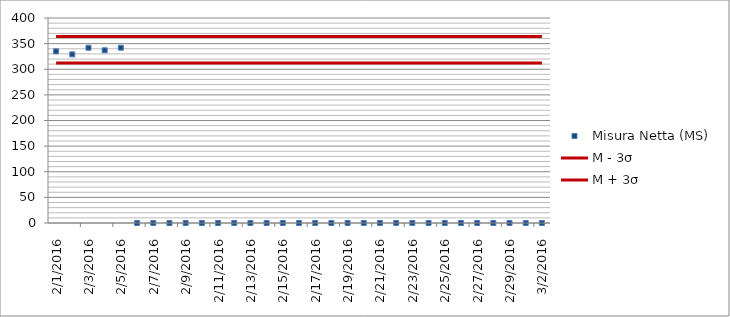
| Category | Misura Netta (MS) | M - 3σ | M + 3σ |
|---|---|---|---|
| 2/1/16 | 335 | 312 | 364 |
| 2/2/16 | 329 | 312 | 364 |
| 2/3/16 | 342 | 312 | 364 |
| 2/4/16 | 337 | 312 | 364 |
| 2/5/16 | 342 | 312 | 364 |
| 2/6/16 | 0 | 312 | 364 |
| 2/7/16 | 0 | 312 | 364 |
| 2/8/16 | 0 | 312 | 364 |
| 2/9/16 | 0 | 312 | 364 |
| 2/10/16 | 0 | 312 | 364 |
| 2/11/16 | 0 | 312 | 364 |
| 2/12/16 | 0 | 312 | 364 |
| 2/13/16 | 0 | 312 | 364 |
| 2/14/16 | 0 | 312 | 364 |
| 2/15/16 | 0 | 312 | 364 |
| 2/16/16 | 0 | 312 | 364 |
| 2/17/16 | 0 | 312 | 364 |
| 2/18/16 | 0 | 312 | 364 |
| 2/19/16 | 0 | 312 | 364 |
| 2/20/16 | 0 | 312 | 364 |
| 2/21/16 | 0 | 312 | 364 |
| 2/22/16 | 0 | 312 | 364 |
| 2/23/16 | 0 | 312 | 364 |
| 2/24/16 | 0 | 312 | 364 |
| 2/25/16 | 0 | 312 | 364 |
| 2/26/16 | 0 | 312 | 364 |
| 2/27/16 | 0 | 312 | 364 |
| 2/28/16 | 0 | 312 | 364 |
| 2/29/16 | 0 | 312 | 364 |
| 3/1/16 | 0 | 312 | 364 |
| 3/2/16 | 0 | 312 | 364 |